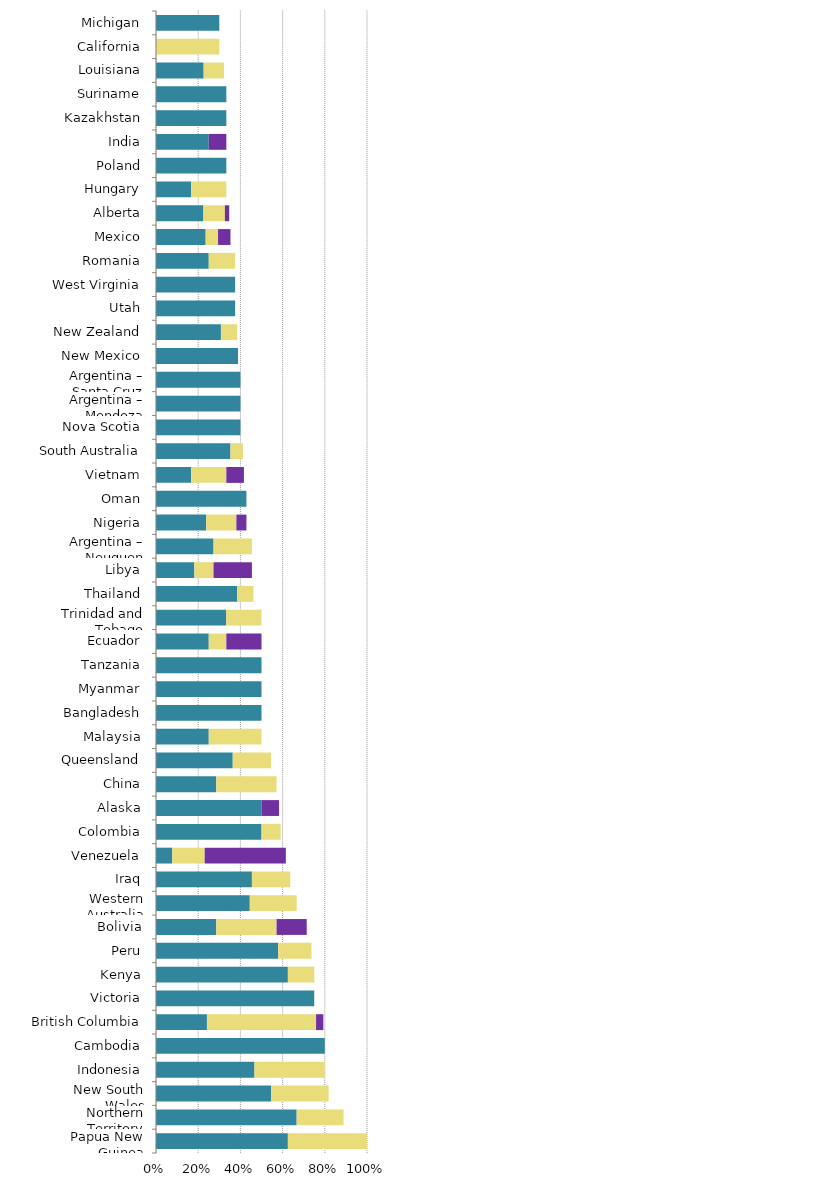
| Category | Mild deterrent to investment | Strong deterrent to investment | Would not pursue investment due to this factor |
|---|---|---|---|
| Papua New Guinea | 0.625 | 0.375 | 0 |
| Northern Territory | 0.667 | 0.222 | 0 |
| New South Wales | 0.545 | 0.273 | 0 |
| Indonesia | 0.467 | 0.333 | 0 |
| Cambodia | 0.8 | 0 | 0 |
| British Columbia | 0.241 | 0.517 | 0.034 |
| Victoria | 0.75 | 0 | 0 |
| Kenya | 0.625 | 0.125 | 0 |
| Peru | 0.579 | 0.158 | 0 |
| Bolivia | 0.286 | 0.286 | 0.143 |
| Western Australia | 0.444 | 0.222 | 0 |
| Iraq | 0.455 | 0.182 | 0 |
| Venezuela | 0.077 | 0.154 | 0.385 |
| Colombia | 0.5 | 0.091 | 0 |
| Alaska | 0.5 | 0 | 0.083 |
| China | 0.286 | 0.286 | 0 |
| Queensland | 0.364 | 0.182 | 0 |
| Malaysia | 0.25 | 0.25 | 0 |
| Bangladesh | 0.5 | 0 | 0 |
| Myanmar | 0.5 | 0 | 0 |
| Tanzania | 0.5 | 0 | 0 |
| Ecuador | 0.25 | 0.083 | 0.167 |
| Trinidad and Tobago | 0.333 | 0.167 | 0 |
| Thailand | 0.385 | 0.077 | 0 |
| Libya | 0.182 | 0.091 | 0.182 |
| Argentina – Neuquen | 0.273 | 0.182 | 0 |
| Nigeria | 0.238 | 0.143 | 0.048 |
| Oman | 0.429 | 0 | 0 |
| Vietnam | 0.167 | 0.167 | 0.083 |
| South Australia | 0.353 | 0.059 | 0 |
| Nova Scotia | 0.4 | 0 | 0 |
| Argentina – Mendoza | 0.4 | 0 | 0 |
| Argentina – Santa Cruz | 0.4 | 0 | 0 |
| New Mexico | 0.389 | 0 | 0 |
| New Zealand | 0.308 | 0.077 | 0 |
| Utah | 0.375 | 0 | 0 |
| West Virginia | 0.375 | 0 | 0 |
| Romania | 0.25 | 0.125 | 0 |
| Mexico | 0.235 | 0.059 | 0.059 |
| Alberta | 0.224 | 0.102 | 0.02 |
| Hungary | 0.167 | 0.167 | 0 |
| Poland | 0.333 | 0 | 0 |
| India | 0.25 | 0 | 0.083 |
| Kazakhstan | 0.333 | 0 | 0 |
| Suriname | 0.333 | 0 | 0 |
| Louisiana | 0.226 | 0.097 | 0 |
| California | 0 | 0.3 | 0 |
| Michigan | 0.3 | 0 | 0 |